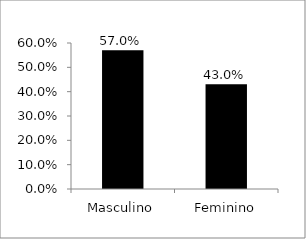
| Category | Series 0 |
|---|---|
| Masculino | 0.57 |
| Feminino | 0.43 |